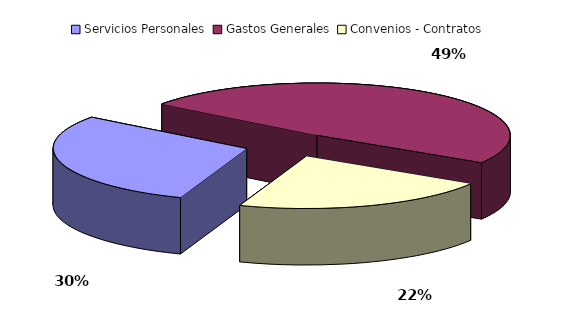
| Category | Series 0 |
|---|---|
| Servicios Personales | 29676585 |
| Gastos Generales | 48585601.16 |
| Convenios - Contratos | 21737813.84 |